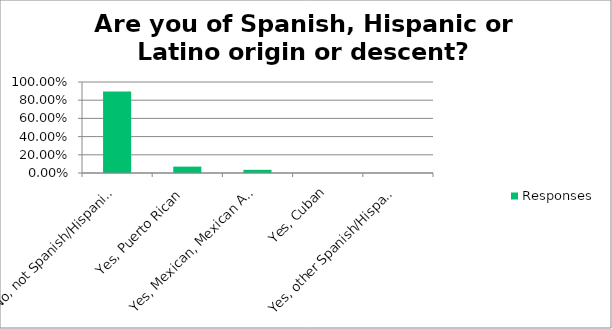
| Category | Responses |
|---|---|
| No, not Spanish/Hispanic/Latino | 0.895 |
| Yes, Puerto Rican | 0.07 |
| Yes, Mexican, Mexican American, Chicano | 0.035 |
| Yes, Cuban | 0 |
| Yes, other Spanish/Hispanic/Latino | 0 |